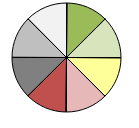
| Category | Series 1 |
|---|---|
| + + | 1 |
| + | 0 |
| o | 0 |
| - | 0 |
| - - | 0 |
| + + | 0 |
| + | 1 |
| o | 0 |
| - | 0 |
| - - | 0 |
| + + | 0 |
| + | 0 |
| o | 1 |
| - | 1 |
| - - | 0 |
| + + | 0 |
| + | 0 |
| o | 0 |
| - | 0 |
| - - | 1 |
| * * | 1 |
| * | 1 |
| o | 1 |
| * * | 0 |
| * | 0 |
| o | 0 |